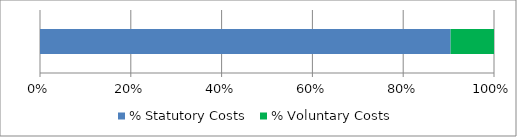
| Category | % Statutory Costs | % Voluntary Costs |
|---|---|---|
| 0 | 0.904 | 0.096 |